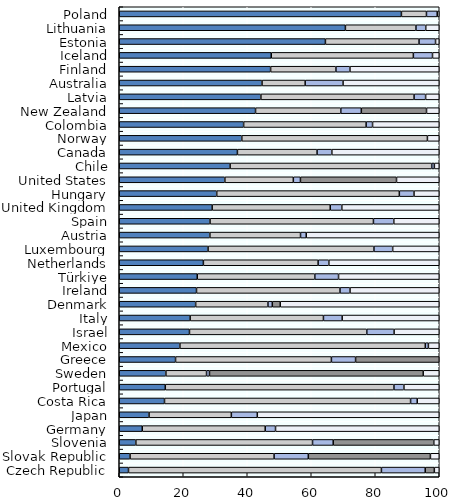
| Category | Equity | Bills and bonds | Cash and deposits | CIS (when look-through unavailable) | Other |
|---|---|---|---|---|---|
| Poland | 88.179 | 7.825 | 3.365 | 0 | 0.632 |
| Lithuania | 70.67 | 22.049 | 3.06 | 0 | 4.221 |
| Estonia | 64.428 | 29.25 | 5.164 | 0 | 1.158 |
| Iceland | 47.501 | 44.409 | 5.981 | 0 | 2.108 |
| Finland | 47.303 | 20.409 | 4.383 | 0 | 27.905 |
| Australia | 44.621 | 13.476 | 11.847 | 0 | 30.055 |
| Latvia | 44.259 | 47.872 | 3.608 | 0 | 4.262 |
| New Zealand | 42.592 | 26.646 | 6.408 | 20.377 | 3.978 |
| Colombia | 38.871 | 38.28 | 2.006 | 0 | 20.843 |
| Norway | 38.3 | 58 | 0 | 0 | 3.7 |
| Canada | 36.927 | 24.892 | 4.618 | 0 | 33.563 |
| Chile | 34.644 | 63.006 | 0.826 | 0 | 1.523 |
| United States | 33.006 | 21.398 | 2.219 | 30.027 | 13.35 |
| Hungary | 30.461 | 57.067 | 4.583 | 0 | 7.89 |
| United Kingdom | 29.035 | 36.898 | 3.619 | 0 | 30.447 |
| Spain | 28.373 | 51.062 | 6.366 | 0 | 14.2 |
| Austria | 28.326 | 28.323 | 1.785 | 0 | 41.566 |
| Luxembourg | 27.764 | 51.83 | 5.852 | 0 | 14.554 |
| Netherlands | 26.293 | 35.855 | 3.357 | 0 | 34.495 |
| Türkiye | 24.377 | 36.739 | 7.415 | 0 | 31.47 |
| Ireland | 24.143 | 44.841 | 3.132 | 0 | 27.884 |
| Denmark | 23.881 | 22.591 | 1.356 | 2.475 | 49.696 |
| Italy | 22.157 | 41.654 | 5.855 | 0 | 30.333 |
| Israel | 21.945 | 55.411 | 8.537 | 0 | 14.107 |
| Mexico | 18.957 | 76.683 | 0.963 | 0 | 3.397 |
| Greece | 17.595 | 48.704 | 7.557 | 26.145 | 0 |
| Sweden | 14.579 | 12.701 | 0.914 | 66.789 | 5.017 |
| Portugal | 14.386 | 71.457 | 3.12 | 0 | 11.038 |
| Costa Rica | 14.144 | 76.899 | 2.082 | 0 | 6.876 |
| Japan | 9.318 | 25.712 | 8.11 | 0 | 56.86 |
| Germany | 7.19 | 38.425 | 3.221 | 0 | 51.164 |
| Slovenia | 5.187 | 55.214 | 6.463 | 31.434 | 1.701 |
| Slovak Republic | 3.378 | 45.009 | 10.7 | 38.152 | 2.761 |
| Czech Republic | 2.89 | 79.042 | 13.684 | 2.848 | 1.536 |